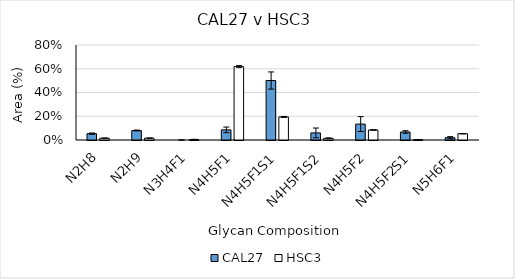
| Category | CAL27 | HSC3 |
|---|---|---|
| N2H8 | 0.053 | 0.015 |
| N2H9 | 0.08 | 0.015 |
| N3H4F1 | 0 | 0.004 |
| N4H5F1 | 0.085 | 0.618 |
| N4H5F1S1 | 0.501 | 0.194 |
| N4H5F1S2 | 0.06 | 0.014 |
| N4H5F2 | 0.134 | 0.084 |
| N4H5F2S1 | 0.067 | 0.002 |
| N5H6F1 | 0.019 | 0.053 |